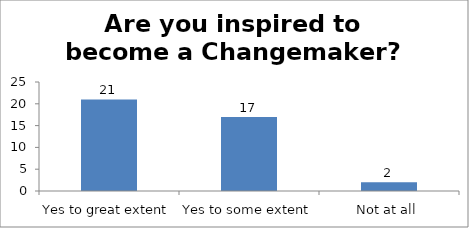
| Category | Are you inspired to become a Changemaker?   |
|---|---|
| Yes to great extent | 21 |
| Yes to some extent | 17 |
| Not at all | 2 |